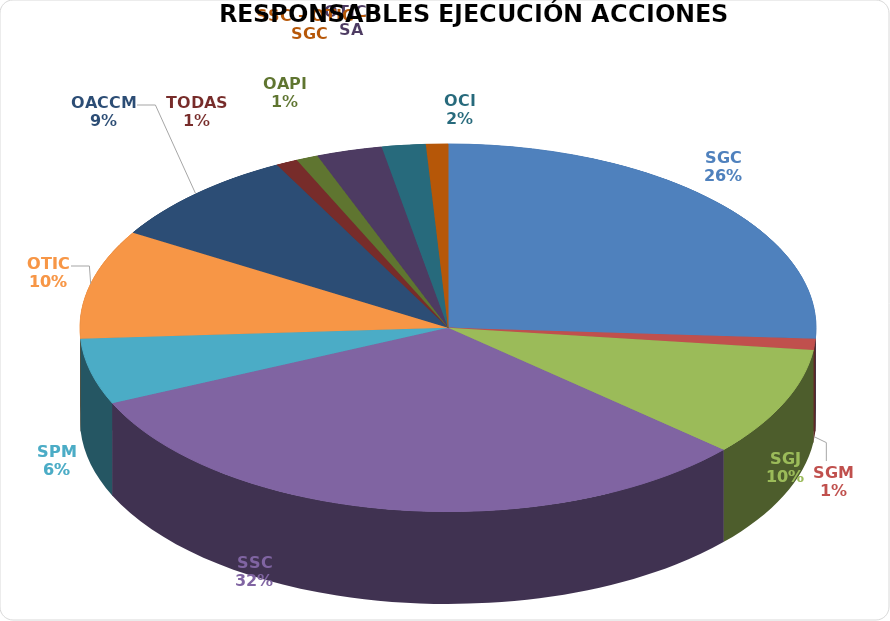
| Category | Series 0 |
|---|---|
| SGC | 27 |
| SGM | 1 |
| SGJ | 10 |
| SSC | 33 |
| SPM | 6 |
| OTIC | 10 |
| OACCM | 9 |
| TODAS | 1 |
| OAPI | 1 |
| OTIC - SA | 3 |
| OCI | 2 |
| SSC - OTIC - SGC | 1 |